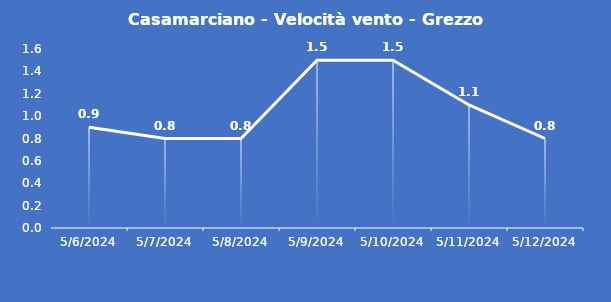
| Category | Casamarciano - Velocità vento - Grezzo (m/s) |
|---|---|
| 5/6/24 | 0.9 |
| 5/7/24 | 0.8 |
| 5/8/24 | 0.8 |
| 5/9/24 | 1.5 |
| 5/10/24 | 1.5 |
| 5/11/24 | 1.1 |
| 5/12/24 | 0.8 |